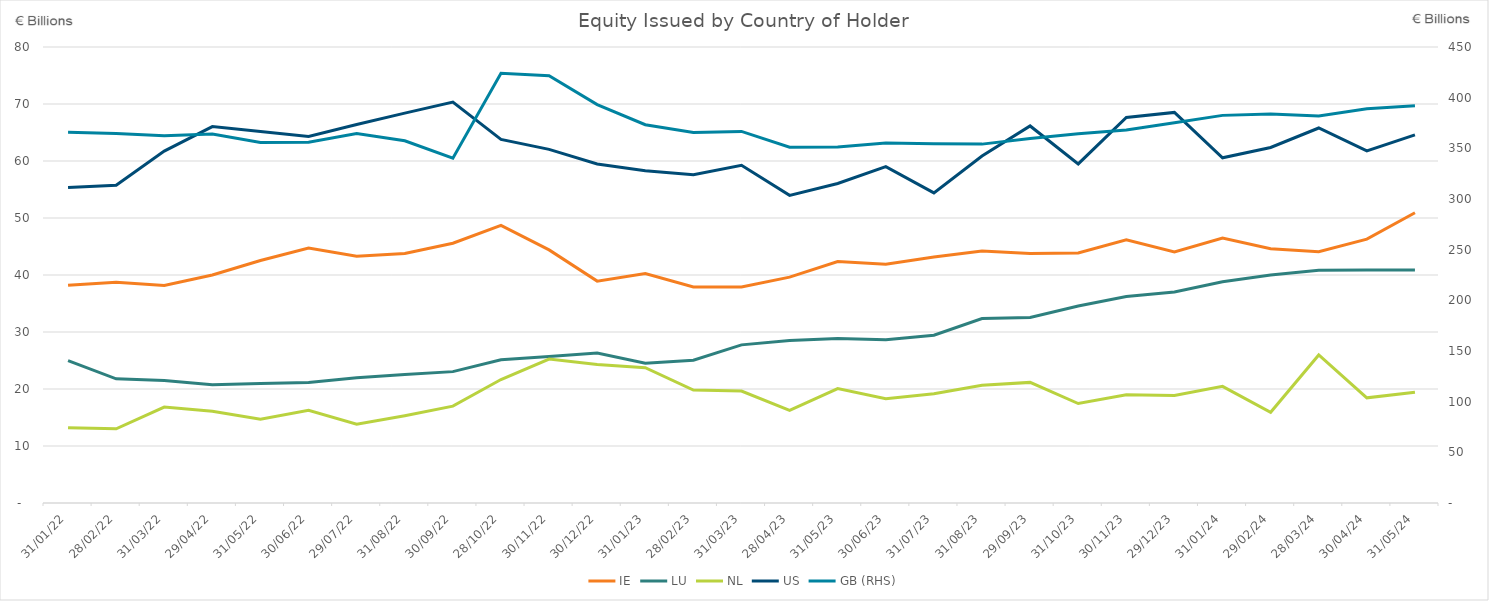
| Category | IE | LU | NL | US |
|---|---|---|---|---|
| 2022-01-31 | 38.188 | 24.98 | 13.2 | 55.338 |
| 2022-02-28 | 38.722 | 21.779 | 13.016 | 55.744 |
| 2022-03-31 | 38.166 | 21.502 | 16.839 | 61.736 |
| 2022-04-29 | 40.005 | 20.731 | 16.096 | 66.032 |
| 2022-05-31 | 42.553 | 20.969 | 14.714 | 65.157 |
| 2022-06-30 | 44.735 | 21.129 | 16.257 | 64.309 |
| 2022-07-29 | 43.293 | 21.984 | 13.815 | 66.414 |
| 2022-08-31 | 43.761 | 22.524 | 15.31 | 68.4 |
| 2022-09-30 | 45.579 | 23.046 | 16.99 | 70.341 |
| 2022-10-28 | 48.696 | 25.117 | 21.66 | 63.798 |
| 2022-11-30 | 44.406 | 25.709 | 25.244 | 62.036 |
| 2022-12-30 | 38.927 | 26.318 | 24.296 | 59.466 |
| 2023-01-31 | 40.264 | 24.511 | 23.726 | 58.294 |
| 2023-02-28 | 37.888 | 25.056 | 19.812 | 57.603 |
| 2023-03-31 | 37.89 | 27.744 | 19.647 | 59.25 |
| 2023-04-28 | 39.632 | 28.502 | 16.232 | 53.973 |
| 2023-05-31 | 42.363 | 28.865 | 20.084 | 56.058 |
| 2023-06-30 | 41.903 | 28.656 | 18.31 | 59 |
| 2023-07-31 | 43.157 | 29.446 | 19.17 | 54.4 |
| 2023-08-31 | 44.222 | 32.365 | 20.667 | 60.871 |
| 2023-09-29 | 43.777 | 32.557 | 21.162 | 66.149 |
| 2023-10-31 | 43.863 | 34.553 | 17.448 | 59.491 |
| 2023-11-30 | 46.188 | 36.21 | 18.998 | 67.628 |
| 2023-12-29 | 44.059 | 37.005 | 18.848 | 68.528 |
| 2024-01-31 | 46.494 | 38.805 | 20.47 | 60.556 |
| 2024-02-29 | 44.607 | 40.019 | 15.912 | 62.376 |
| 2024-03-28 | 44.077 | 40.842 | 25.969 | 65.792 |
| 2024-04-30 | 46.291 | 40.874 | 18.45 | 61.789 |
| 2024-05-31 | 50.92 | 40.869 | 19.417 | 64.595 |